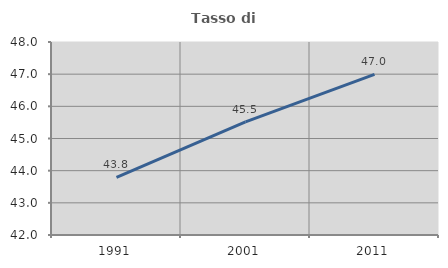
| Category | Tasso di occupazione   |
|---|---|
| 1991.0 | 43.791 |
| 2001.0 | 45.514 |
| 2011.0 | 46.994 |